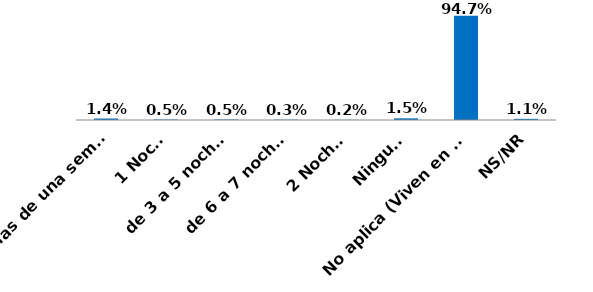
| Category | Series 0 |
|---|---|
| Mas de una semana | 0.014 |
| 1 Noche | 0.005 |
| de 3 a 5 noches | 0.005 |
| de 6 a 7 noches | 0.003 |
| 2 Noches | 0.002 |
| Ninguna | 0.015 |
| No aplica (Viven en Bogotá) | 0.947 |
| NS/NR | 0.011 |